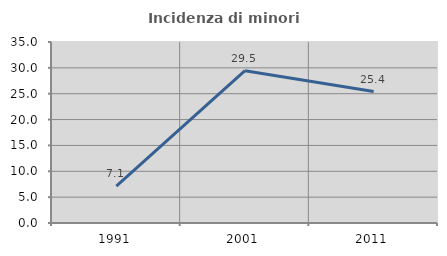
| Category | Incidenza di minori stranieri |
|---|---|
| 1991.0 | 7.143 |
| 2001.0 | 29.452 |
| 2011.0 | 25.416 |